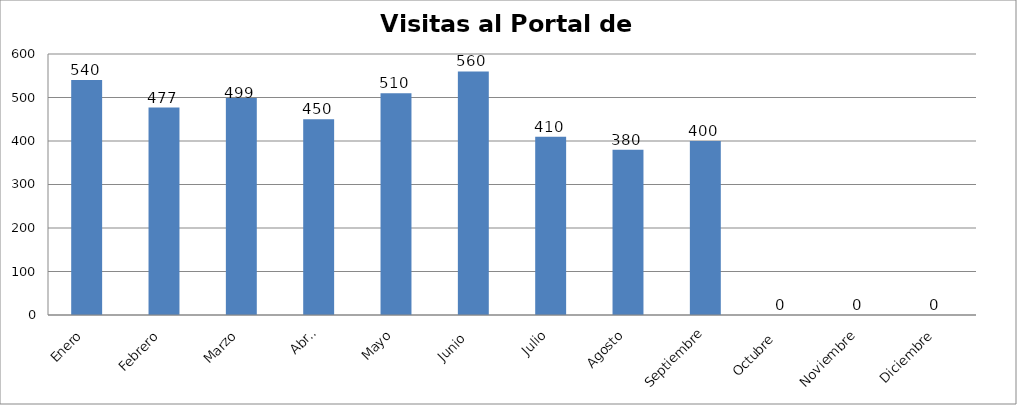
| Category | Series 0 |
|---|---|
| Enero | 540 |
| Febrero | 477 |
| Marzo | 499 |
| Abril | 450 |
| Mayo | 510 |
| Junio  | 560 |
| Julio | 410 |
| Agosto | 380 |
| Septiembre | 400 |
| Octubre  | 0 |
| Noviembre | 0 |
| Diciembre | 0 |